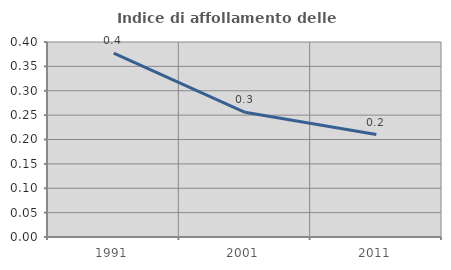
| Category | Indice di affollamento delle abitazioni  |
|---|---|
| 1991.0 | 0.377 |
| 2001.0 | 0.256 |
| 2011.0 | 0.21 |